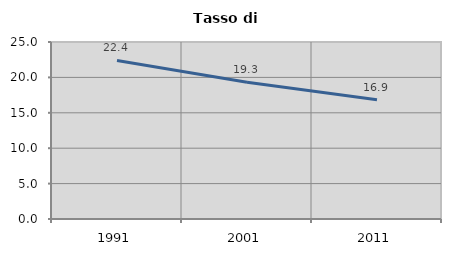
| Category | Tasso di disoccupazione   |
|---|---|
| 1991.0 | 22.393 |
| 2001.0 | 19.307 |
| 2011.0 | 16.853 |